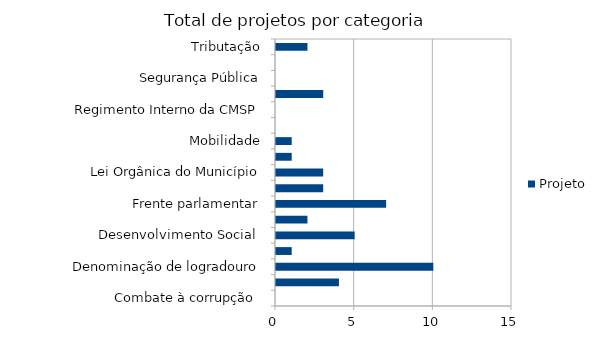
| Category | Projeto |
|---|---|
| Combate à corrupção  | 0 |
| Datas comemorativas e homenagens diversas | 4 |
| Denominação de logradouro | 10 |
| Desenvolvimento Econômico | 1 |
| Desenvolvimento Social  | 5 |
| Educação e cultura | 2 |
| Frente parlamentar | 7 |
| Habitação e Urbanismo | 3 |
| Lei Orgânica do Município | 3 |
| Meio ambiente ,  | 1 |
| Mobilidade | 1 |
| Proteção dos animais | 0 |
| Regimento Interno da CMSP | 0 |
| Saude-Esporte | 3 |
| Segurança Pública | 0 |
| Transparencia | 0 |
| Tributação | 2 |